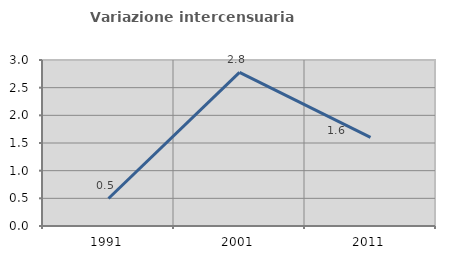
| Category | Variazione intercensuaria annua |
|---|---|
| 1991.0 | 0.497 |
| 2001.0 | 2.775 |
| 2011.0 | 1.601 |